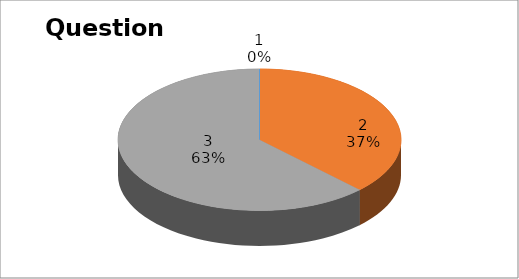
| Category | Series 0 |
|---|---|
| 0 | 0 |
| 1 | 3 |
| 2 | 5 |